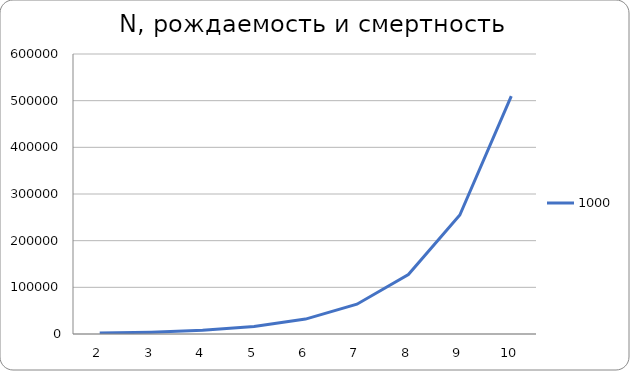
| Category | 1000 |
|---|---|
| 2.0 | 1999 |
| 3.0 | 3996.001 |
| 4.0 | 7988.006 |
| 5.0 | 15968.024 |
| 6.0 | 31920.08 |
| 7.0 | 63808.24 |
| 8.0 | 127552.671 |
| 9.0 | 254977.79 |
| 10.0 | 509700.603 |